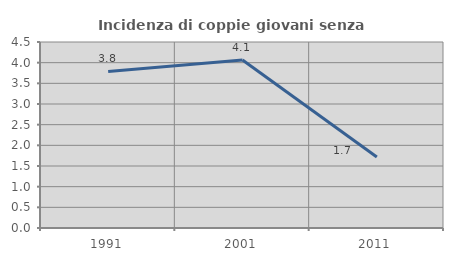
| Category | Incidenza di coppie giovani senza figli |
|---|---|
| 1991.0 | 3.789 |
| 2001.0 | 4.064 |
| 2011.0 | 1.717 |